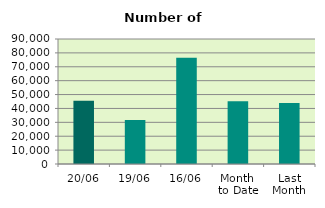
| Category | Series 0 |
|---|---|
| 20/06 | 45528 |
| 19/06 | 31744 |
| 16/06 | 76558 |
| Month 
to Date | 45141.571 |
| Last
Month | 44009.364 |